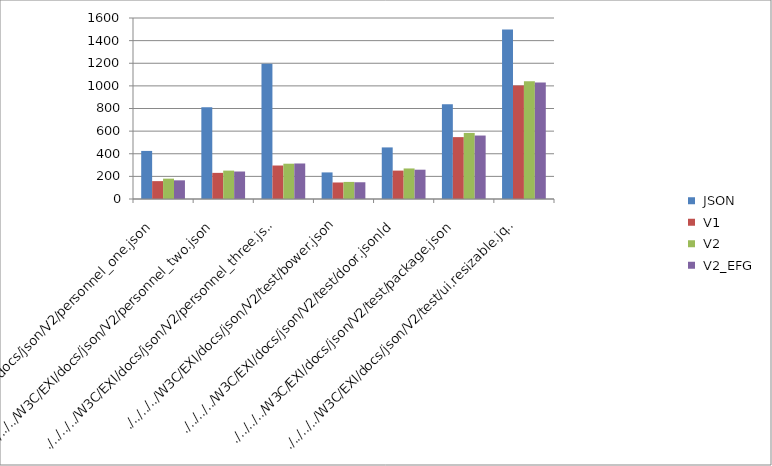
| Category |  JSON |  V1 |  V2 |  V2_EFG |
|---|---|---|---|---|
| ./../../../W3C/EXI/docs/json/V2/personnel_one.json | 425 | 158 | 180 | 165 |
| ./../../../W3C/EXI/docs/json/V2/personnel_two.json | 810 | 231 | 251 | 243 |
| ./../../../W3C/EXI/docs/json/V2/personnel_three.json | 1195 | 296 | 312 | 314 |
| ./../../../W3C/EXI/docs/json/V2/test/bower.json | 235 | 146 | 151 | 148 |
| ./../../../W3C/EXI/docs/json/V2/test/door.jsonld | 456 | 251 | 270 | 259 |
| ./../../../W3C/EXI/docs/json/V2/test/package.json | 838 | 547 | 584 | 561 |
| ./../../../W3C/EXI/docs/json/V2/test/ui.resizable.jquery.json | 1498 | 1004 | 1041 | 1030 |